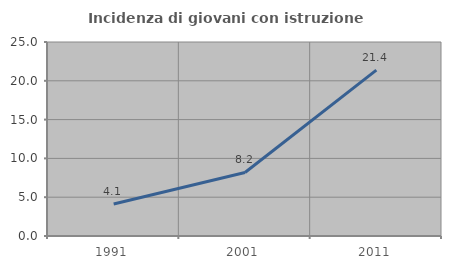
| Category | Incidenza di giovani con istruzione universitaria |
|---|---|
| 1991.0 | 4.134 |
| 2001.0 | 8.183 |
| 2011.0 | 21.374 |